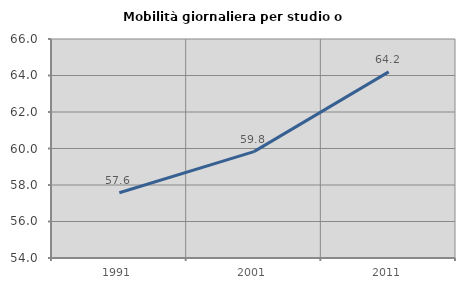
| Category | Mobilità giornaliera per studio o lavoro |
|---|---|
| 1991.0 | 57.578 |
| 2001.0 | 59.828 |
| 2011.0 | 64.199 |